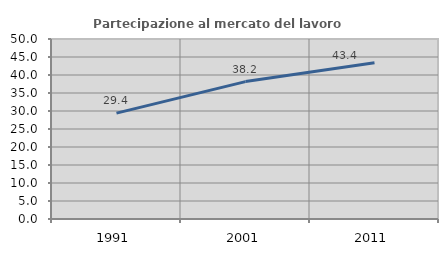
| Category | Partecipazione al mercato del lavoro  femminile |
|---|---|
| 1991.0 | 29.404 |
| 2001.0 | 38.169 |
| 2011.0 | 43.385 |